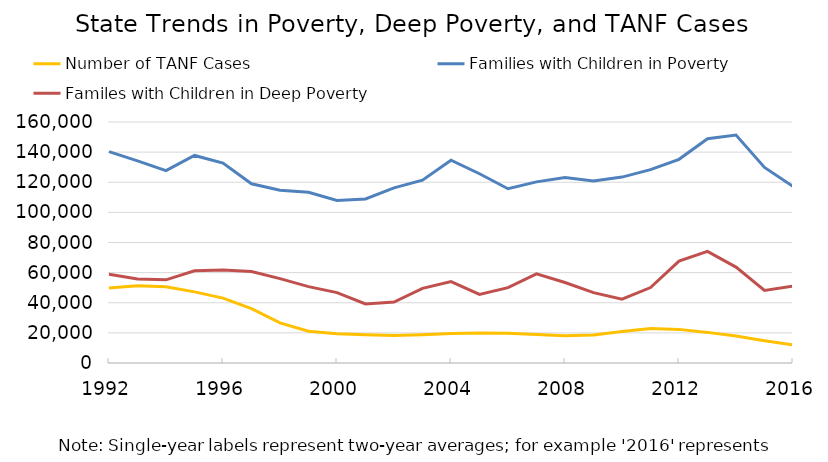
| Category | Number of TANF Cases | Families with Children in Poverty | Familes with Children in Deep Poverty |
|---|---|---|---|
| 1992.0 | 49722.292 | 140321 | 58918 |
| nan | 51276.542 | 134165.5 | 55707 |
| nan | 50549 | 127762 | 55214 |
| nan | 47236.375 | 137794.5 | 61245.5 |
| 1996.0 | 43098.792 | 132675 | 61801.5 |
| nan | 36124.75 | 118946 | 60708.5 |
| nan | 26676.75 | 114729.5 | 56043.5 |
| nan | 21134 | 113369.5 | 50708 |
| 2000.0 | 19452.375 | 107949 | 46707 |
| nan | 18774.625 | 108883.5 | 39217.5 |
| nan | 18337.458 | 116304 | 40507.5 |
| nan | 18788.417 | 121419 | 49529 |
| 2004.0 | 19511.042 | 134615.5 | 54046 |
| nan | 19928.875 | 125638 | 45578.5 |
| nan | 19800.542 | 115679 | 50043 |
| nan | 18898 | 120260 | 59142 |
| 2008.0 | 18162.125 | 123119 | 53458 |
| nan | 18625.958 | 120864.5 | 46737.5 |
| nan | 20864.75 | 123412 | 42424 |
| nan | 22861.083 | 128381 | 50090.5 |
| 2012.0 | 22321.708 | 135242 | 67637.5 |
| nan | 20324.583 | 148935.5 | 74141.5 |
| nan | 17876.25 | 151369.5 | 63659.5 |
| nan | 14735.708 | 129819.5 | 48217.5 |
| 2016.0 | 11966 | 117267 | 51006.5 |